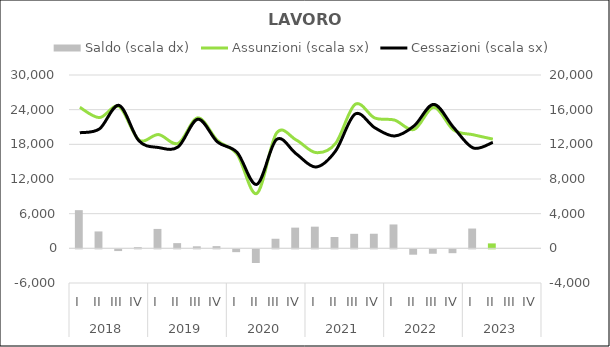
| Category | Saldo (scala dx) |
|---|---|
| 0 | 4405 |
| 1 | 1950 |
| 2 | -200 |
| 3 | 135 |
| 4 | 2240 |
| 5 | 600 |
| 6 | 235 |
| 7 | 255 |
| 8 | -325 |
| 9 | -1580 |
| 10 | 1105 |
| 11 | 2390 |
| 12 | 2500 |
| 13 | 1305 |
| 14 | 1675 |
| 15 | 1685 |
| 16 | 2755 |
| 17 | -620 |
| 18 | -510 |
| 19 | -445 |
| 20 | 2285 |
| 21 | 570 |
| 22 | 0 |
| 23 | 0 |